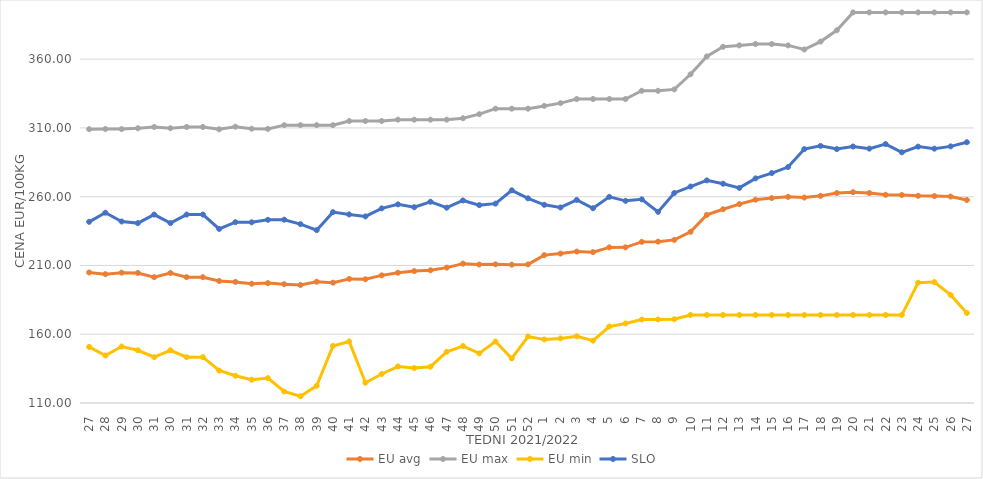
| Category | EU avg | EU max | EU min | SLO |
|---|---|---|---|---|
| 27.0 | 204.914 | 309.08 | 150.789 | 241.72 |
| 28.0 | 203.681 | 309.21 | 144.56 | 248.33 |
| 29.0 | 204.773 | 309.15 | 151.052 | 241.96 |
| 30.0 | 204.558 | 309.78 | 148.33 | 240.79 |
| 31.0 | 201.483 | 310.67 | 143.33 | 247 |
| 30.0 | 204.558 | 309.78 | 148.33 | 240.79 |
| 31.0 | 201.483 | 310.67 | 143.33 | 247 |
| 32.0 | 201.483 | 310.67 | 143.33 | 247 |
| 33.0 | 198.691 | 309 | 133.607 | 236.54 |
| 34.0 | 198.027 | 310.9 | 129.797 | 241.45 |
| 35.0 | 196.72 | 309.41 | 126.926 | 241.39 |
| 36.0 | 197.157 | 309.28 | 128.099 | 243.19 |
| 37.0 | 196.375 | 312 | 118.364 | 243.28 |
| 38.0 | 195.821 | 312 | 114.892 | 240.06 |
| 39.0 | 198.179 | 312 | 122.517 | 235.66 |
| 40.0 | 197.482 | 312 | 151.488 | 248.77 |
| 41.0 | 200.22 | 315 | 154.74 | 247.07 |
| 42.0 | 199.965 | 315 | 124.748 | 245.64 |
| 43.0 | 202.804 | 315 | 131.104 | 251.53 |
| 44.0 | 204.713 | 316 | 136.6 | 254.42 |
| 45.0 | 205.906 | 316 | 135.362 | 252.35 |
| 46.0 | 206.476 | 316 | 136.39 | 256.33 |
| 47.0 | 208.415 | 316 | 147.192 | 252.01 |
| 48.0 | 211.314 | 317 | 151.41 | 257.25 |
| 49.0 | 210.677 | 320 | 146.064 | 253.87 |
| 50.0 | 210.823 | 324 | 154.698 | 254.94 |
| 51.0 | 210.59 | 324 | 142.382 | 264.65 |
| 52.0 | 210.763 | 324 | 158.333 | 258.8 |
| 1.0 | 217.519 | 326 | 156.222 | 254.09 |
| 2.0 | 218.654 | 328 | 156.969 | 252.15 |
| 3.0 | 220.098 | 331 | 158.511 | 257.65 |
| 4.0 | 219.685 | 331 | 155.346 | 251.6 |
| 5.0 | 223.143 | 331 | 165.59 | 259.87 |
| 6.0 | 223.178 | 331 | 167.86 | 256.97 |
| 7.0 | 227.145 | 337 | 170.719 | 258.07 |
| 8.0 | 227.312 | 337 | 170.743 | 248.97 |
| 9.0 | 228.588 | 338 | 170.92 | 262.72 |
| 10.0 | 234.434 | 349 | 174 | 267.38 |
| 11.0 | 246.762 | 362 | 174 | 271.86 |
| 12.0 | 250.845 | 369 | 174 | 269.43 |
| 13.0 | 254.568 | 370 | 174 | 266.39 |
| 14.0 | 257.819 | 371 | 174 | 273.3 |
| 15.0 | 259 | 371 | 174 | 277.18 |
| 16.0 | 259.873 | 370 | 174 | 281.55 |
| 17.0 | 259.349 | 367 | 174 | 294.59 |
| 18.0 | 260.598 | 372.758 | 174 | 296.93 |
| 19.0 | 262.667 | 381 | 174 | 294.6 |
| 20.0 | 263.289 | 394 | 174 | 296.48 |
| 21.0 | 262.638 | 394 | 174 | 294.94 |
| 22.0 | 261.386 | 394 | 174 | 298.26 |
| 23.0 | 261.226 | 394 | 174 | 292.27 |
| 24.0 | 260.643 | 394 | 197.477 | 296.39 |
| 25.0 | 260.418 | 394 | 197.916 | 294.93 |
| 26.0 | 260.096 | 394 | 188.58 | 296.56 |
| 27.0 | 257.585 | 394 | 175.451 | 299.59 |